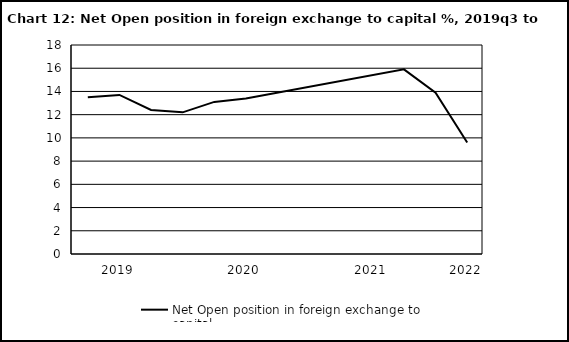
| Category | Net Open position in foreign exchange to capital |
|---|---|
| nan | 13.5 |
| 2019.0 | 13.7 |
| nan | 12.4 |
| nan | 12.2 |
| nan | 13.1 |
| 2020.0 | 13.4 |
| nan | 0 |
| nan | 0 |
| nan | 0 |
| 2021.0 | 0 |
| nan | 15.9 |
| nan | 13.9 |
| 2022.0 | 9.6 |